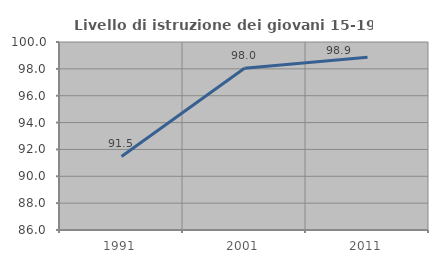
| Category | Livello di istruzione dei giovani 15-19 anni |
|---|---|
| 1991.0 | 91.478 |
| 2001.0 | 98.045 |
| 2011.0 | 98.86 |